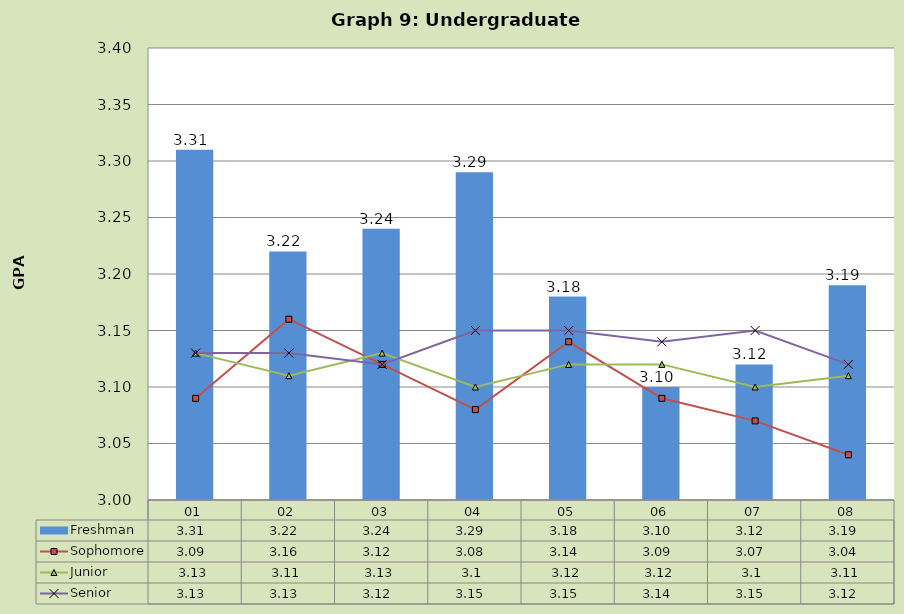
| Category | Freshman |
|---|---|
| 01 | 3.31 |
| 02 | 3.22 |
| 03 | 3.24 |
| 04 | 3.29 |
| 05 | 3.18 |
| 06 | 3.1 |
| 07 | 3.12 |
| 08 | 3.19 |